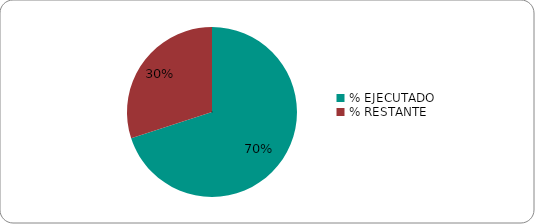
| Category | Series 0 |
|---|---|
| % EJECUTADO | 0.7 |
| % RESTANTE | 0.3 |